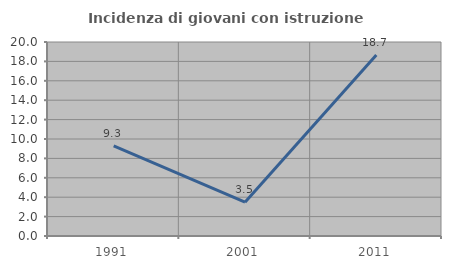
| Category | Incidenza di giovani con istruzione universitaria |
|---|---|
| 1991.0 | 9.302 |
| 2001.0 | 3.488 |
| 2011.0 | 18.667 |